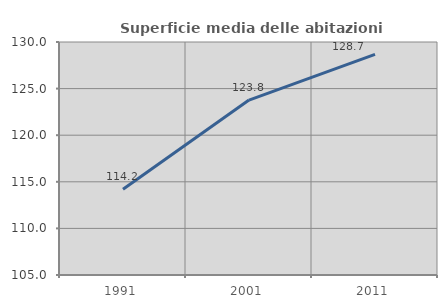
| Category | Superficie media delle abitazioni occupate |
|---|---|
| 1991.0 | 114.195 |
| 2001.0 | 123.772 |
| 2011.0 | 128.663 |